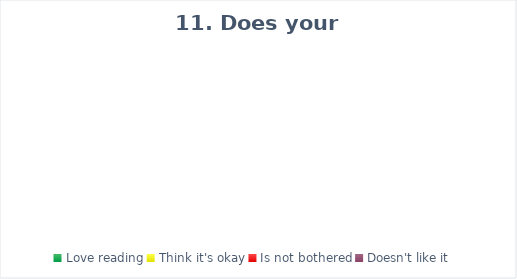
| Category | Series 0 |
|---|---|
| Love reading | 0 |
| Think it's okay | 0 |
| Is not bothered | 0 |
| Doesn't like it | 0 |